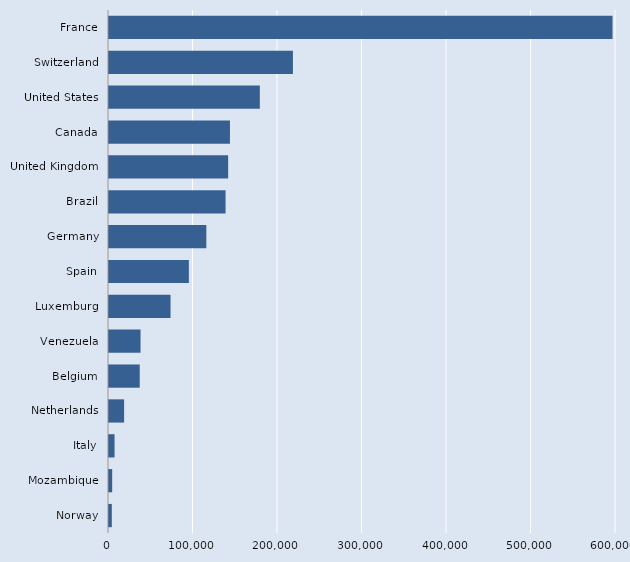
| Category | Series 0 |
|---|---|
| Norway | 3328 |
| Mozambique | 3767 |
| Italy | 6577 |
| Netherlands | 17893 |
| Belgium | 36378 |
| Venezuela | 37326 |
| Luxemburg | 72821 |
| Spain | 94520 |
| Germany | 115190 |
| Brazil | 137973 |
| United Kingdom | 141000 |
| Canada | 143160 |
| United States | 178500 |
| Switzerland | 217662 |
| France | 595900 |